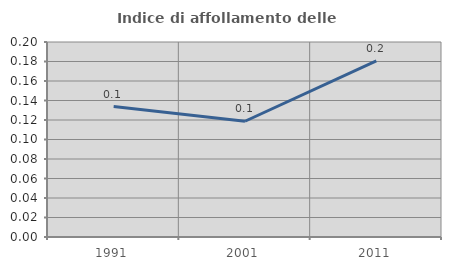
| Category | Indice di affollamento delle abitazioni  |
|---|---|
| 1991.0 | 0.134 |
| 2001.0 | 0.119 |
| 2011.0 | 0.181 |